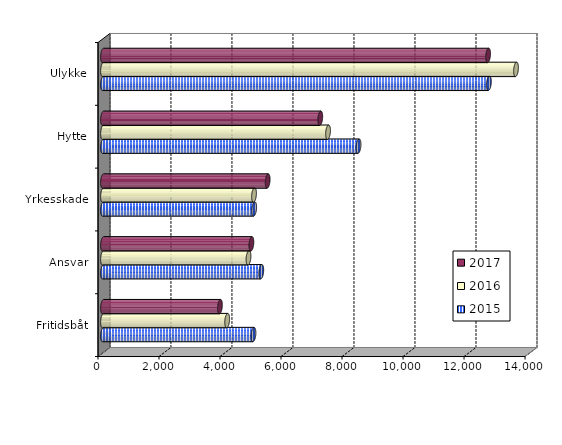
| Category | 2015 | 2016 | 2017 |
|---|---|---|---|
| Fritidsbåt | 4932.395 | 4070.67 | 3833.546 |
| Ansvar | 5188.462 | 4769.704 | 4864.401 |
| Yrkesskade | 4955 | 4950.777 | 5397.574 |
| Hytte | 8377.47 | 7377.228 | 7122.066 |
| Ulykke | 12649.523 | 13539.56 | 12623.589 |